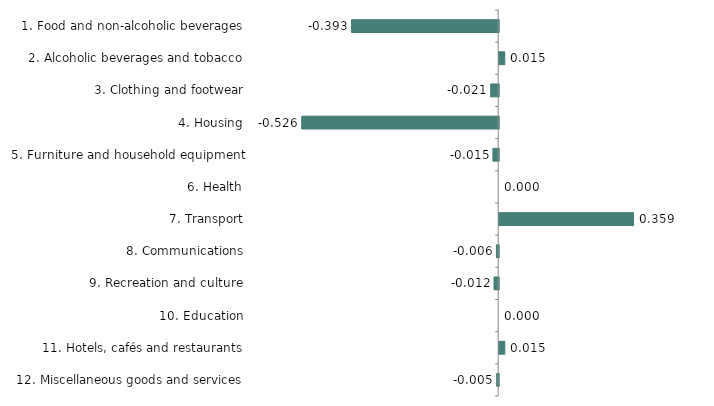
| Category | Series 0 |
|---|---|
| 1. Food and non-alcoholic beverages | -0.393 |
| 2. Alcoholic beverages and tobacco | 0.015 |
| 3. Clothing and footwear | -0.021 |
| 4. Housing | -0.526 |
| 5. Furniture and household equipment | -0.015 |
| 6. Health | 0 |
| 7. Transport | 0.359 |
| 8. Communications | -0.006 |
| 9. Recreation and culture | -0.012 |
| 10. Education | 0 |
| 11. Hotels, cafés and restaurants | 0.015 |
| 12. Miscellaneous goods and services | -0.005 |